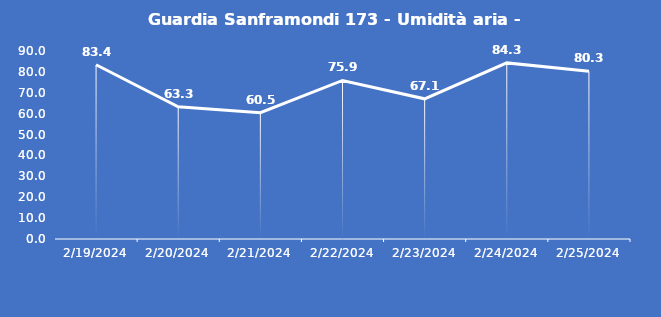
| Category | Guardia Sanframondi 173 - Umidità aria - Grezzo (%) |
|---|---|
| 2/19/24 | 83.4 |
| 2/20/24 | 63.3 |
| 2/21/24 | 60.5 |
| 2/22/24 | 75.9 |
| 2/23/24 | 67.1 |
| 2/24/24 | 84.3 |
| 2/25/24 | 80.3 |